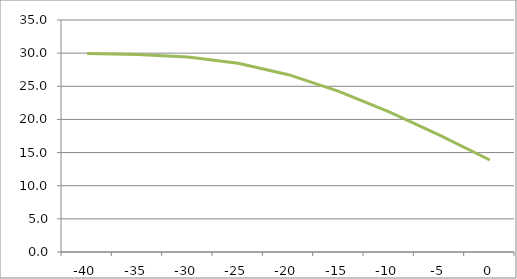
| Category | Series 2 |
|---|---|
| -40.0 | 29.932 |
| -35.0 | 29.793 |
| -30.0 | 29.401 |
| -25.0 | 28.471 |
| -20.0 | 26.75 |
| -15.0 | 24.242 |
| -10.0 | 21.133 |
| -5.0 | 17.624 |
| 0.0 | 13.878 |